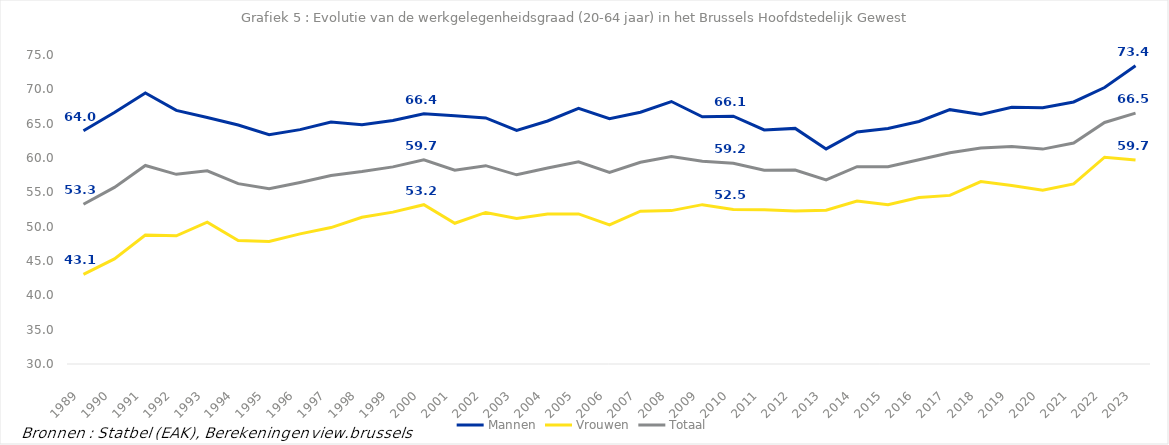
| Category | Mannen | Vrouwen | Totaal |
|---|---|---|---|
| 1989.0 | 63.976 | 43.053 | 53.264 |
| 1990.0 | 66.614 | 45.311 | 55.725 |
| 1991.0 | 69.48 | 48.771 | 58.909 |
| 1992.0 | 66.933 | 48.67 | 57.621 |
| 1993.0 | 65.892 | 50.652 | 58.145 |
| 1994.0 | 64.798 | 47.981 | 56.264 |
| 1995.0 | 63.401 | 47.834 | 55.532 |
| 1996.0 | 64.134 | 48.952 | 56.444 |
| 1997.0 | 65.248 | 49.87 | 57.458 |
| 1998.0 | 64.855 | 51.376 | 58.03 |
| 1999.0 | 65.46 | 52.12 | 58.709 |
| 2000.0 | 66.441 | 53.197 | 59.738 |
| 2001.0 | 66.147 | 50.492 | 58.229 |
| 2002.0 | 65.829 | 52.073 | 58.881 |
| 2003.0 | 64.024 | 51.176 | 57.55 |
| 2004.0 | 65.392 | 51.844 | 58.551 |
| 2005.0 | 67.219 | 51.855 | 59.446 |
| 2006.0 | 65.714 | 50.251 | 57.893 |
| 2007.0 | 66.662 | 52.26 | 59.384 |
| 2008.0 | 68.225 | 52.337 | 60.202 |
| 2009.0 | 66.004 | 53.206 | 59.543 |
| 2010.0 | 66.093 | 52.509 | 59.236 |
| 2011.0 | 64.081 | 52.461 | 58.219 |
| 2012.0 | 64.314 | 52.265 | 58.241 |
| 2013.0 | 61.325 | 52.385 | 56.82 |
| 2014.0 | 63.791 | 53.733 | 58.727 |
| 2015.0 | 64.295 | 53.209 | 58.721 |
| 2016.0 | 65.322 | 54.257 | 59.757 |
| 2017.0 | 67.041 | 54.555 | 60.762 |
| 2018.0 | 66.347 | 56.563 | 61.439 |
| 2019.0 | 67.391 | 55.994 | 61.679 |
| 2020.0 | 67.307 | 55.307 | 61.296 |
| 2021.0 | 68.16 | 56.23 | 62.19 |
| 2022.0 | 70.262 | 60.118 | 65.171 |
| 2023.0 | 73.442 | 59.726 | 66.544 |